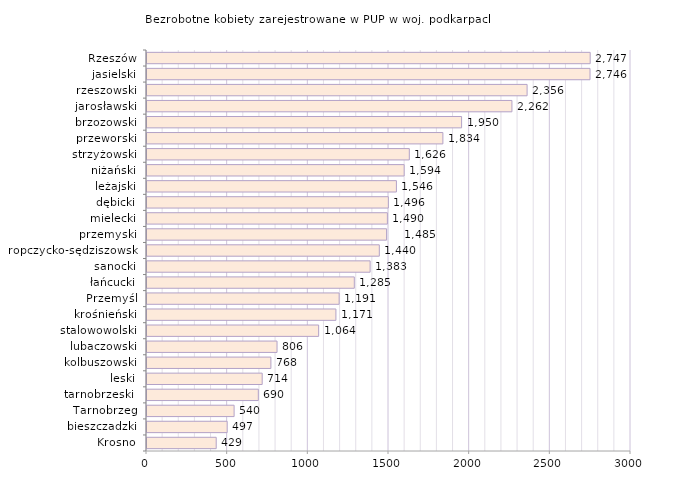
| Category | Bezrobotne kobiety zarejestrowane w PUP w woj. podkarpackim |
|---|---|
| Krosno | 429 |
| bieszczadzki | 497 |
| Tarnobrzeg | 540 |
| tarnobrzeski  | 690 |
| leski | 714 |
| kolbuszowski | 768 |
| lubaczowski | 806 |
| stalowowolski | 1064 |
| krośnieński | 1171 |
| Przemyśl | 1191 |
| łańcucki | 1285 |
| sanocki | 1383 |
| ropczycko-sędziszowski | 1440 |
| przemyski | 1485 |
| mielecki | 1490 |
| dębicki | 1496 |
| leżajski | 1546 |
| niżański | 1594 |
| strzyżowski | 1626 |
| przeworski | 1834 |
| brzozowski | 1950 |
| jarosławski | 2262 |
| rzeszowski | 2356 |
| jasielski | 2746 |
| Rzeszów | 2747 |